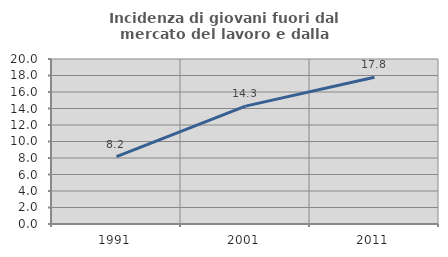
| Category | Incidenza di giovani fuori dal mercato del lavoro e dalla formazione  |
|---|---|
| 1991.0 | 8.163 |
| 2001.0 | 14.286 |
| 2011.0 | 17.778 |